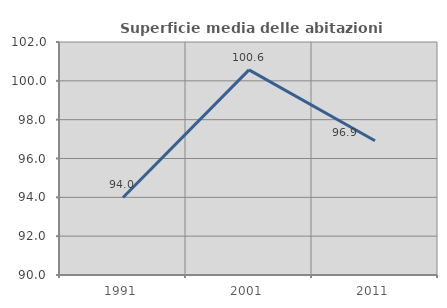
| Category | Superficie media delle abitazioni occupate |
|---|---|
| 1991.0 | 93.994 |
| 2001.0 | 100.562 |
| 2011.0 | 96.916 |